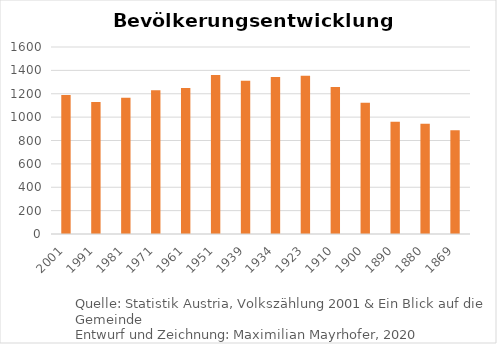
| Category | Bevölkerungsentwicklung |
|---|---|
| 2001.0 | 1189 |
| 1991.0 | 1130 |
| 1981.0 | 1166 |
| 1971.0 | 1231 |
| 1961.0 | 1249 |
| 1951.0 | 1360 |
| 1939.0 | 1312 |
| 1934.0 | 1343 |
| 1923.0 | 1353 |
| 1910.0 | 1258 |
| 1900.0 | 1122 |
| 1890.0 | 961 |
| 1880.0 | 943 |
| 1869.0 | 888 |